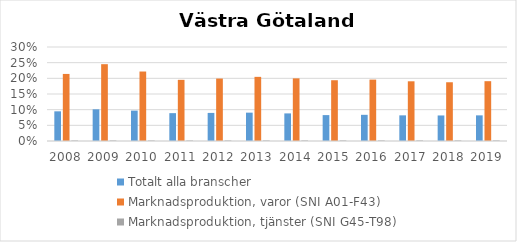
| Category | Totalt alla branscher | Marknadsproduktion, varor (SNI A01-F43) | Marknadsproduktion, tjänster (SNI G45-T98) |
|---|---|---|---|
| 2008 | 0.095 | 0.214 | 0.002 |
| 2009 | 0.101 | 0.245 | 0.002 |
| 2010 | 0.097 | 0.222 | 0.002 |
| 2011 | 0.089 | 0.195 | 0.002 |
| 2012 | 0.09 | 0.199 | 0.002 |
| 2013 | 0.09 | 0.205 | 0.002 |
| 2014 | 0.088 | 0.2 | 0.002 |
| 2015 | 0.083 | 0.194 | 0.002 |
| 2016 | 0.084 | 0.196 | 0.002 |
| 2017 | 0.082 | 0.191 | 0.002 |
| 2018 | 0.081 | 0.187 | 0.002 |
| 2019 | 0.082 | 0.191 | 0.002 |